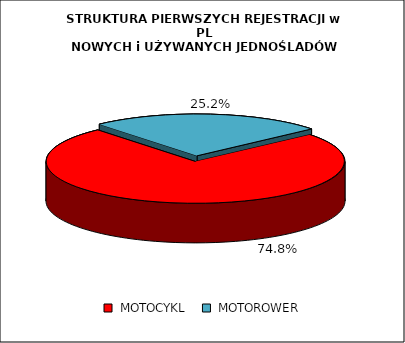
| Category | RAZEM |
|---|---|
|  MOTOCYKL  | 0.748 |
|  MOTOROWER  | 0.252 |